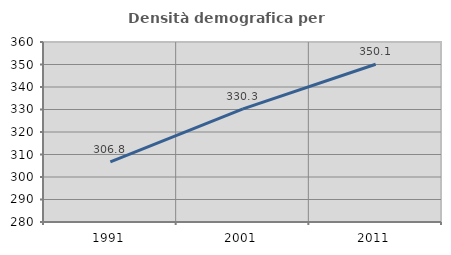
| Category | Densità demografica |
|---|---|
| 1991.0 | 306.755 |
| 2001.0 | 330.282 |
| 2011.0 | 350.115 |